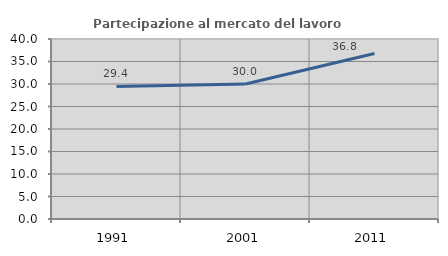
| Category | Partecipazione al mercato del lavoro  femminile |
|---|---|
| 1991.0 | 29.448 |
| 2001.0 | 30.009 |
| 2011.0 | 36.79 |